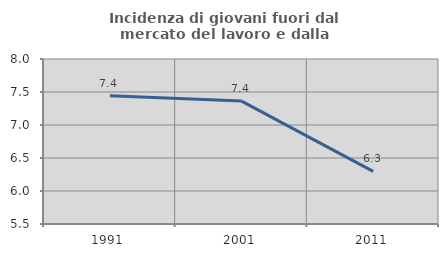
| Category | Incidenza di giovani fuori dal mercato del lavoro e dalla formazione  |
|---|---|
| 1991.0 | 7.444 |
| 2001.0 | 7.362 |
| 2011.0 | 6.296 |